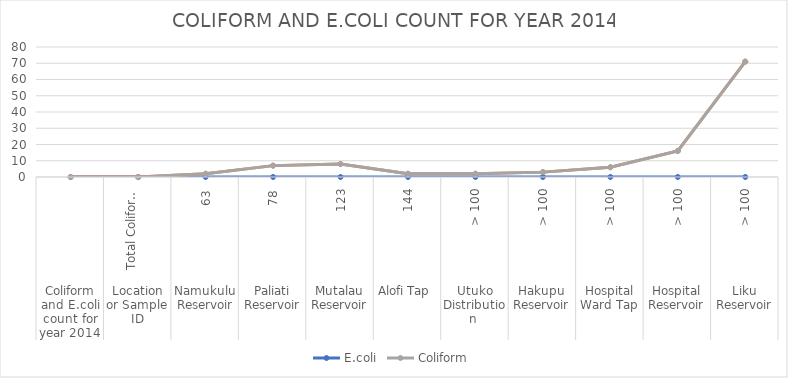
| Category | E.coli | Coliform |
|---|---|---|
| 0 |  |  |
| 1 |  |  |
| 2 |  |  |
| 3 |  |  |
| 4 |  |  |
| 5 |  |  |
| 6 |  |  |
| 7 |  |  |
| 8 |  |  |
| 9 |  |  |
| 10 |  |  |